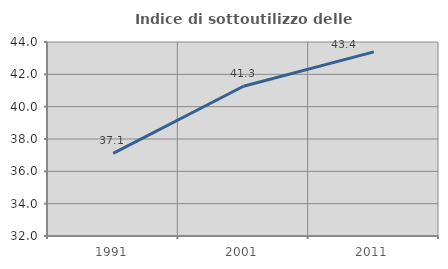
| Category | Indice di sottoutilizzo delle abitazioni  |
|---|---|
| 1991.0 | 37.113 |
| 2001.0 | 41.262 |
| 2011.0 | 43.386 |